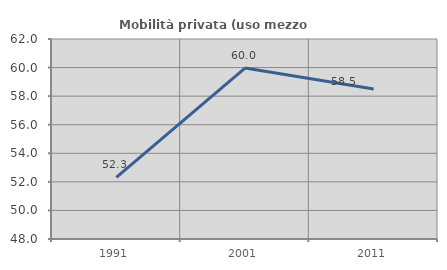
| Category | Mobilità privata (uso mezzo privato) |
|---|---|
| 1991.0 | 52.321 |
| 2001.0 | 59.964 |
| 2011.0 | 58.503 |